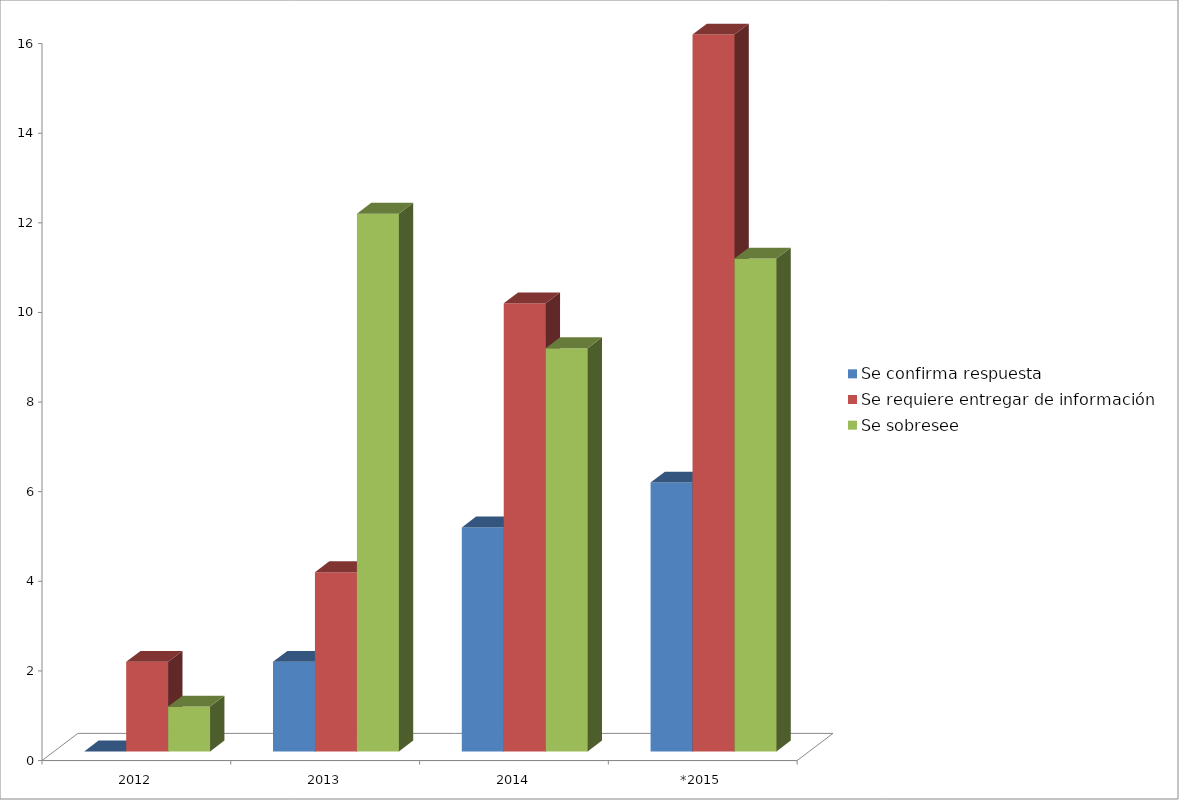
| Category | Se confirma respuesta | Se requiere entregar de información  | Se sobresee  |
|---|---|---|---|
| 2012 | 0 | 2 | 1 |
| 2013 | 2 | 4 | 12 |
| 2014 | 5 | 10 | 9 |
| *2015 | 6 | 16 | 11 |